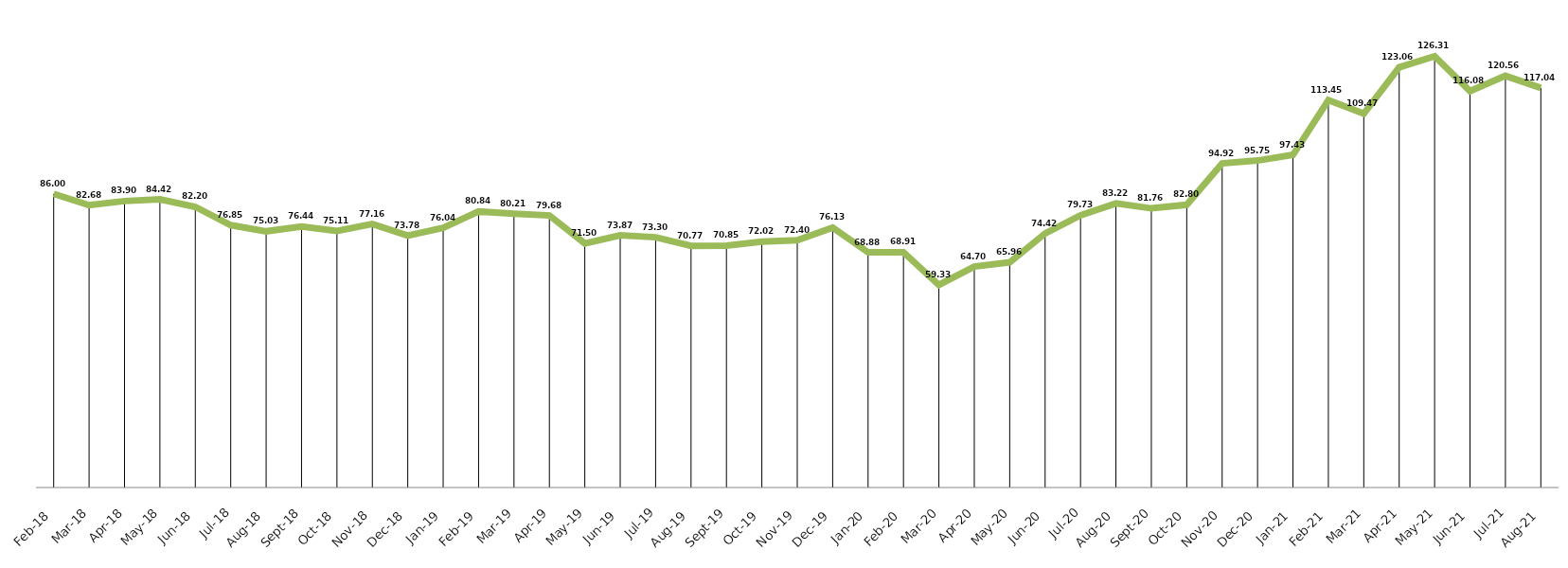
| Category | Series 0 |
|---|---|
| 2018-02-28 | 85.999 |
| 2018-03-31 | 82.684 |
| 2018-04-30 | 83.896 |
| 2018-05-31 | 84.416 |
| 2018-06-30 | 82.202 |
| 2018-07-31 | 76.846 |
| 2018-08-31 | 75.034 |
| 2018-09-30 | 76.438 |
| 2018-10-31 | 75.114 |
| 2018-11-30 | 77.155 |
| 2018-12-31 | 73.779 |
| 2019-01-31 | 76.042 |
| 2019-02-28 | 80.841 |
| 2019-03-31 | 80.21 |
| 2019-04-30 | 79.678 |
| 2019-05-31 | 71.497 |
| 2019-06-30 | 73.865 |
| 2019-07-31 | 73.296 |
| 2019-08-31 | 70.773 |
| 2019-09-30 | 70.847 |
| 2019-10-31 | 72.022 |
| 2019-11-30 | 72.4 |
| 2019-12-31 | 76.135 |
| 2020-01-31 | 68.881 |
| 2020-02-29 | 68.905 |
| 2020-03-31 | 59.332 |
| 2020-04-30 | 64.7 |
| 2020-05-31 | 65.955 |
| 2020-06-30 | 74.416 |
| 2020-07-31 | 79.734 |
| 2020-08-31 | 83.216 |
| 2020-09-30 | 81.756 |
| 2020-10-31 | 82.801 |
| 2020-11-30 | 94.923 |
| 2020-12-31 | 95.751 |
| 2021-01-31 | 97.427 |
| 2021-02-28 | 113.451 |
| 2021-03-31 | 109.468 |
| 2021-04-30 | 123.055 |
| 2021-05-31 | 126.314 |
| 2021-06-30 | 116.079 |
| 2021-07-31 | 120.563 |
| 2021-08-31 | 117.038 |